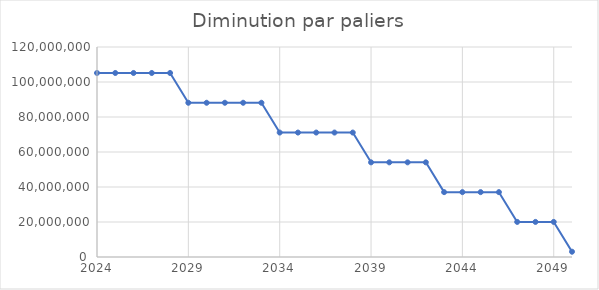
| Category | Emissions (t eqCO2) |
|---|---|
| 2024.0 | 105153500 |
| 2025.0 | 105153500 |
| 2026.0 | 105153500 |
| 2027.0 | 105153500 |
| 2028.0 | 105153500 |
| 2029.0 | 88132250 |
| 2030.0 | 88132250 |
| 2031.0 | 88132250 |
| 2032.0 | 88132250 |
| 2033.0 | 88132250 |
| 2034.0 | 71111000 |
| 2035.0 | 71111000 |
| 2036.0 | 71111000 |
| 2037.0 | 71111000 |
| 2038.0 | 71111000 |
| 2039.0 | 54089750 |
| 2040.0 | 54089750 |
| 2041.0 | 54089750 |
| 2042.0 | 54089750 |
| 2043.0 | 37068500 |
| 2044.0 | 37068500 |
| 2045.0 | 37068500 |
| 2046.0 | 37068500 |
| 2047.0 | 20047250 |
| 2048.0 | 20047250 |
| 2049.0 | 20047250 |
| 2050.0 | 3026000 |